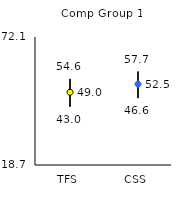
| Category | 25th | 75th | Mean |
|---|---|---|---|
| TFS | 43 | 54.6 | 49.04 |
| CSS | 46.6 | 57.7 | 52.45 |